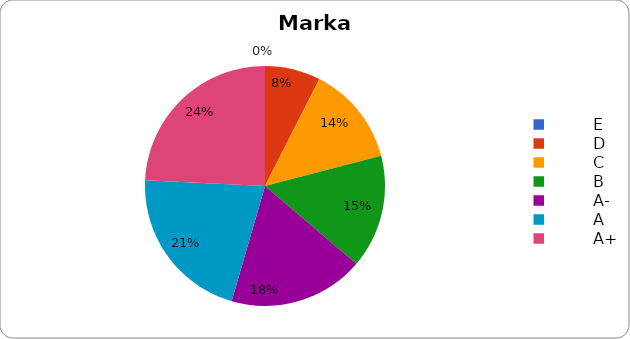
| Category | Markah |
|---|---|
|          E | 0 |
|          D | 25 |
|          C | 45 |
|          B | 51 |
|          A- | 61 |
|          A | 71 |
|          A+ | 81 |